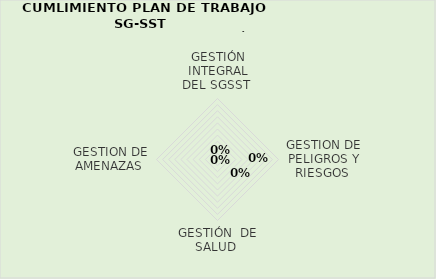
| Category | 2do TRIMESTRE  |
|---|---|
| GESTIÓN INTEGRAL DEL SGSST  | 0 |
| GESTION DE PELIGROS Y RIESGOS  | 0 |
| GESTIÓN  DE SALUD  | 0 |
| GESTION DE AMENAZAS  | 0 |